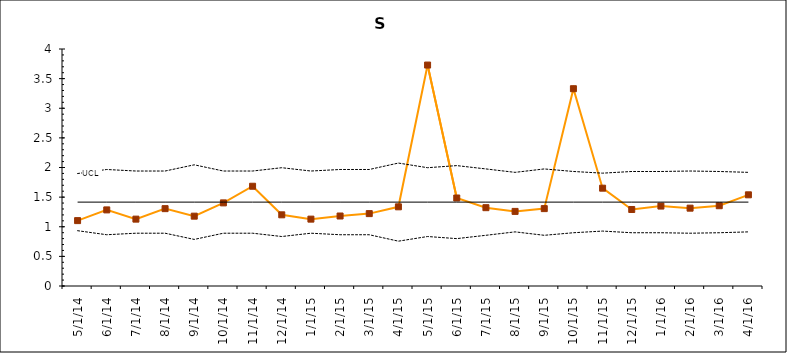
| Category | Subgroup | Center | UCL | LCL |
|---|---|---|---|---|
| 5/1/14 | 1.104 | 1.416 | 1.898 | 0.933 |
| 6/1/14 | 1.284 | 1.416 | 1.966 | 0.865 |
| 7/1/14 | 1.129 | 1.416 | 1.941 | 0.891 |
| 8/1/14 | 1.305 | 1.416 | 1.941 | 0.891 |
| 9/1/14 | 1.179 | 1.416 | 2.045 | 0.786 |
| 10/1/14 | 1.403 | 1.416 | 1.941 | 0.891 |
| 11/1/14 | 1.684 | 1.416 | 1.941 | 0.891 |
| 12/1/14 | 1.201 | 1.416 | 1.996 | 0.835 |
| 1/1/15 | 1.129 | 1.416 | 1.941 | 0.891 |
| 2/1/15 | 1.181 | 1.416 | 1.966 | 0.865 |
| 3/1/15 | 1.222 | 1.416 | 1.966 | 0.865 |
| 4/1/15 | 1.336 | 1.416 | 2.075 | 0.757 |
| 5/1/15 | 3.729 | 1.416 | 1.996 | 0.835 |
| 6/1/15 | 1.485 | 1.416 | 2.032 | 0.8 |
| 7/1/15 | 1.322 | 1.416 | 1.976 | 0.856 |
| 8/1/15 | 1.259 | 1.416 | 1.918 | 0.914 |
| 9/1/15 | 1.306 | 1.416 | 1.976 | 0.856 |
| 10/1/15 | 3.33 | 1.416 | 1.933 | 0.899 |
| 11/1/15 | 1.651 | 1.416 | 1.905 | 0.927 |
| 12/1/15 | 1.291 | 1.416 | 1.933 | 0.899 |
| 1/1/16 | 1.349 | 1.416 | 1.933 | 0.899 |
| 2/1/16 | 1.314 | 1.416 | 1.941 | 0.891 |
| 3/1/16 | 1.355 | 1.416 | 1.933 | 0.899 |
| 4/1/16 | 1.539 | 1.416 | 1.918 | 0.914 |